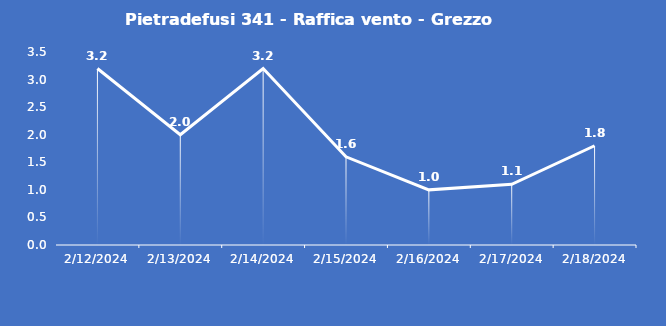
| Category | Pietradefusi 341 - Raffica vento - Grezzo (m/s) |
|---|---|
| 2/12/24 | 3.2 |
| 2/13/24 | 2 |
| 2/14/24 | 3.2 |
| 2/15/24 | 1.6 |
| 2/16/24 | 1 |
| 2/17/24 | 1.1 |
| 2/18/24 | 1.8 |